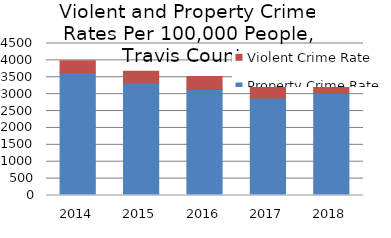
| Category | Property Crime Rate      | Violent Crime Rate |
|---|---|---|
| 2014.0 | 3630.894 | 357.424 |
| 2015.0 | 3329.093 | 347.522 |
| 2016.0 | 3138.737 | 387.428 |
| 2017.0 | 2884.651 | 385.511 |
| 2018.0 | 3022.932 | 371.496 |